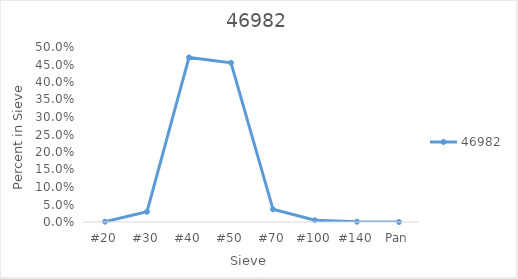
| Category | 46982 |
|---|---|
| #20 | 0.001 |
| #30 | 0.029 |
| #40 | 0.47 |
| #50 | 0.455 |
| #70 | 0.036 |
| #100 | 0.005 |
| #140 | 0.001 |
| Pan | 0 |